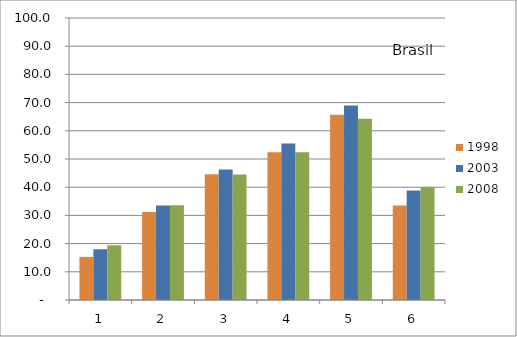
| Category | 1998 | 2003 | 2008 |
|---|---|---|---|
| 0 | 15.3 | 18 | 19.4 |
| 1 | 31.2 | 33.5 | 33.6 |
| 2 | 44.6 | 46.3 | 44.5 |
| 3 | 52.4 | 55.5 | 52.4 |
| 4 | 65.7 | 69 | 64.3 |
| 5 | 33.5 | 38.8 | 40.1 |